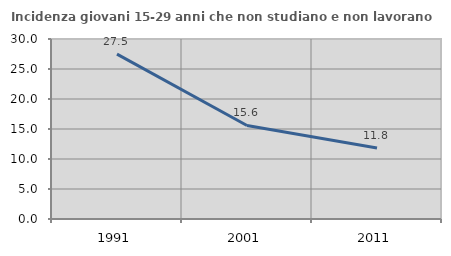
| Category | Incidenza giovani 15-29 anni che non studiano e non lavorano  |
|---|---|
| 1991.0 | 27.488 |
| 2001.0 | 15.584 |
| 2011.0 | 11.828 |